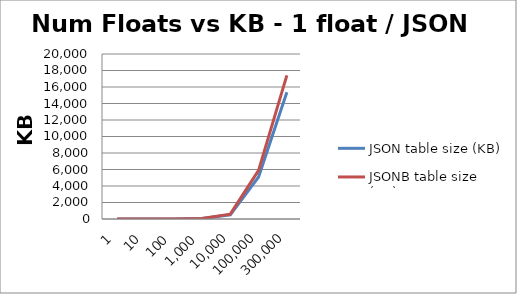
| Category | JSON table size (KB) | JSONB table size (KB) |
|---|---|---|
| 1.0 | 8 | 8 |
| 10.0 | 8 | 8 |
| 100.0 | 8 | 8 |
| 1000.0 | 48 | 56 |
| 10000.0 | 512 | 592 |
| 100000.0 | 5096 | 5888 |
| 300000.0 | 15360 | 17408 |